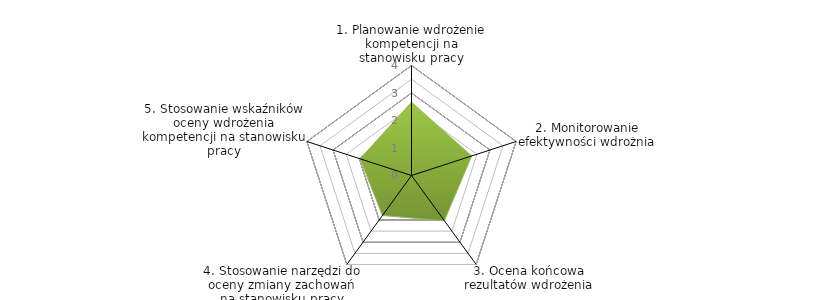
| Category | Series 0 | BENCHMARK |
|---|---|---|
| 1. Planowanie wdrożenie kompetencji na stanowisku pracy |  | 2.667 |
| 2. Monitorowanie efektywności wdrożnia |  | 2.3 |
| 3. Ocena końcowa rezultatów wdrożenia |  | 2.033 |
| 4. Stosowanie narzędzi do oceny zmiany zachowań na stanowisku pracy |  | 1.8 |
| 5. Stosowanie wskaźników oceny wdrożenia kompetencji na stanowisku pracy |  | 1.967 |